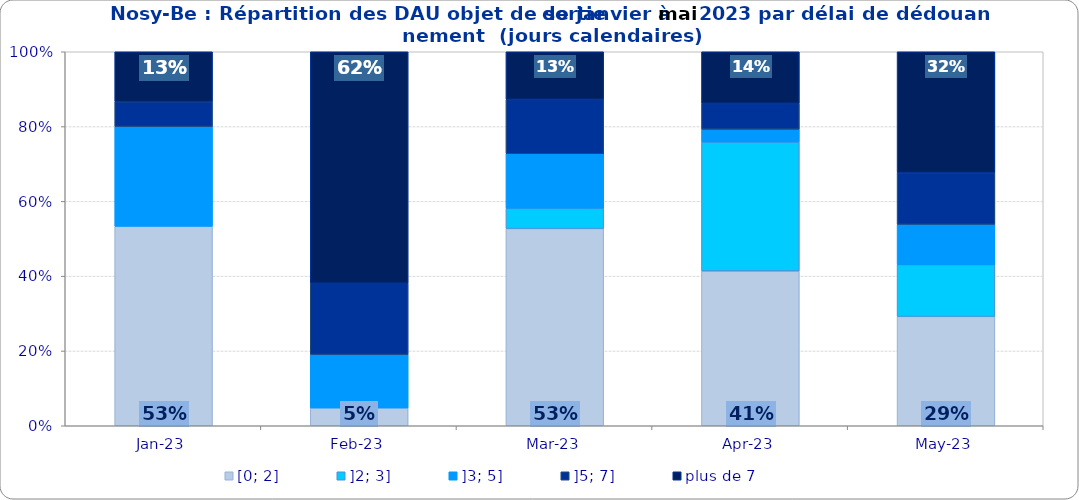
| Category | [0; 2] | ]2; 3] | ]3; 5] | ]5; 7] | plus de 7 |
|---|---|---|---|---|---|
| 2023-01-01 | 0.533 | 0 | 0.267 | 0.067 | 0.133 |
| 2023-02-01 | 0.048 | 0 | 0.143 | 0.19 | 0.619 |
| 2023-03-01 | 0.527 | 0.055 | 0.145 | 0.145 | 0.127 |
| 2023-04-01 | 0.414 | 0.345 | 0.034 | 0.069 | 0.138 |
| 2023-05-01 | 0.292 | 0.138 | 0.108 | 0.138 | 0.323 |